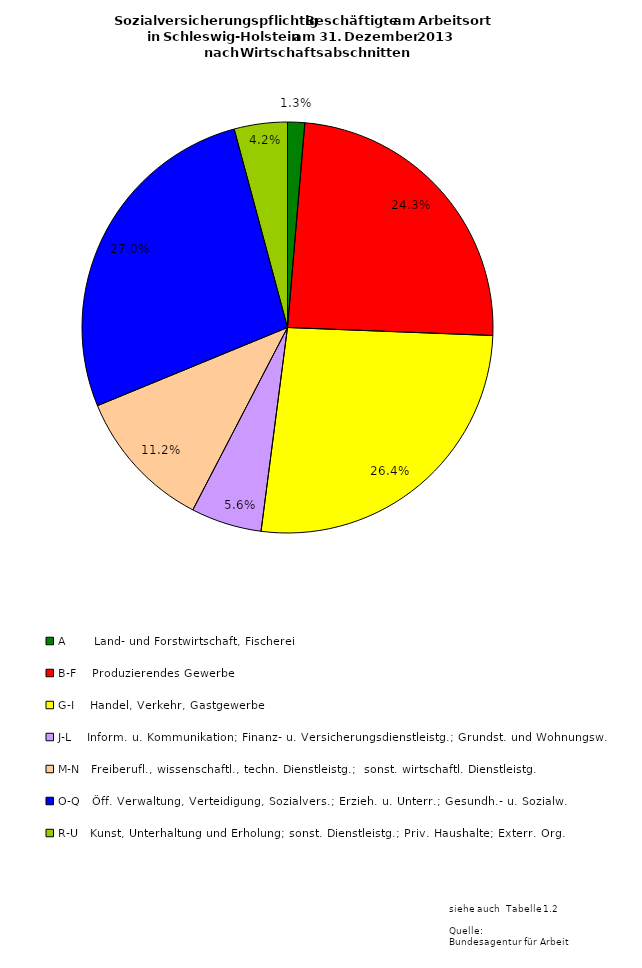
| Category | Series 0 | Series 1 | Series 2 |
|---|---|---|---|
| A       Land- und Forstwirtschaft, Fischerei | 11917 | 3290 | 8627 |
| B-F    Produzierendes Gewerbe | 214758 | 49226 | 165532 |
| G-I    Handel, Verkehr, Gastgewerbe | 233885 | 105454 | 128431 |
| J-L    Inform. u. Kommunikation; Finanz- u. Versicherungsdienstleistg.; Grundst. und Wohnungsw. | 49226 | 23875 | 25351 |
| M-N   Freiberufl., wissenschaftl., techn. Dienstleistg.;  sonst. wirtschaftl. Dienstleistg.  | 98795 | 47269 | 51526 |
| O-Q   Öff. Verwaltung, Verteidigung, Sozialvers.; Erzieh. u. Unterr.; Gesundh.- u. Sozialw. | 239168 | 168682 | 70486 |
| R-U   Kunst, Unterhaltung und Erholung; sonst. Dienstleistg.; Priv. Haushalte; Exterr. Org. | 36984 | 25613 | 11371 |